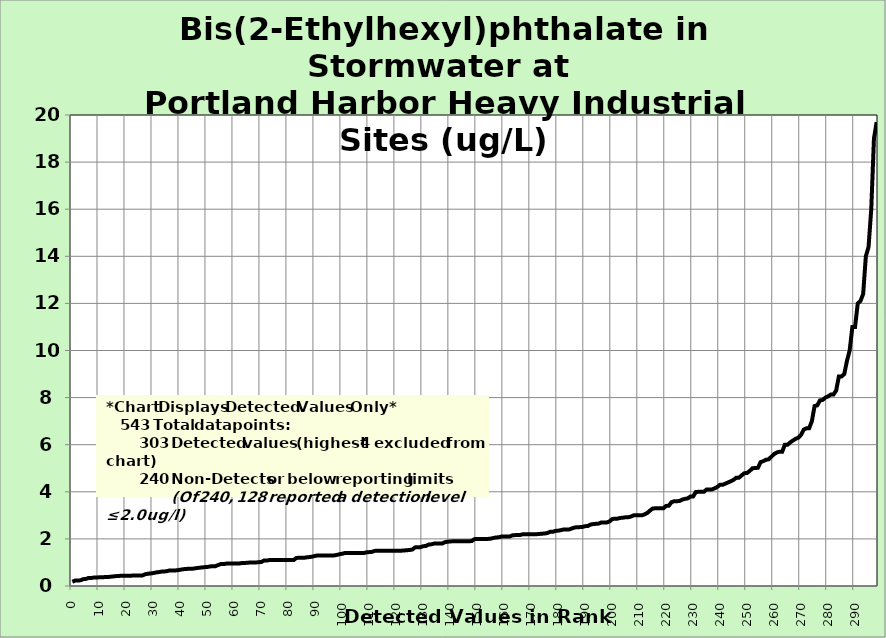
| Category | BEHP |
|---|---|
| 0.0 | 0.18 |
| 1.0 | 0.23 |
| 2.0 | 0.236 |
| 3.0 | 0.24 |
| 4.0 | 0.29 |
| 5.0 | 0.3 |
| 6.0 | 0.34 |
| 7.0 | 0.34 |
| 8.0 | 0.36 |
| 9.0 | 0.36 |
| 10.0 | 0.37 |
| 11.0 | 0.37 |
| 12.0 | 0.379 |
| 13.0 | 0.382 |
| 14.0 | 0.391 |
| 15.0 | 0.405 |
| 16.0 | 0.419 |
| 17.0 | 0.42 |
| 18.0 | 0.44 |
| 19.0 | 0.44 |
| 20.0 | 0.44 |
| 21.0 | 0.44 |
| 22.0 | 0.44 |
| 23.0 | 0.447 |
| 24.0 | 0.45 |
| 25.0 | 0.45 |
| 26.0 | 0.45 |
| 27.0 | 0.5 |
| 28.0 | 0.52 |
| 29.0 | 0.533 |
| 30.0 | 0.55 |
| 31.0 | 0.575 |
| 32.0 | 0.59 |
| 33.0 | 0.61 |
| 34.0 | 0.616 |
| 35.0 | 0.63 |
| 36.0 | 0.66 |
| 37.0 | 0.66 |
| 38.0 | 0.66 |
| 39.0 | 0.67 |
| 40.0 | 0.691 |
| 41.0 | 0.71 |
| 42.0 | 0.724 |
| 43.0 | 0.73 |
| 44.0 | 0.73 |
| 45.0 | 0.74 |
| 46.0 | 0.76 |
| 47.0 | 0.774 |
| 48.0 | 0.788 |
| 49.0 | 0.8 |
| 50.0 | 0.81 |
| 51.0 | 0.83 |
| 52.0 | 0.84 |
| 53.0 | 0.842 |
| 54.0 | 0.89 |
| 55.0 | 0.93 |
| 56.0 | 0.93 |
| 57.0 | 0.95 |
| 58.0 | 0.952 |
| 59.0 | 0.952 |
| 60.0 | 0.952 |
| 61.0 | 0.96 |
| 62.0 | 0.96 |
| 63.0 | 0.977 |
| 64.0 | 0.979 |
| 65.0 | 0.99 |
| 66.0 | 0.997 |
| 67.0 | 1 |
| 68.0 | 1 |
| 69.0 | 1.01 |
| 70.0 | 1.02 |
| 71.0 | 1.08 |
| 72.0 | 1.08 |
| 73.0 | 1.1 |
| 74.0 | 1.1 |
| 75.0 | 1.1 |
| 76.0 | 1.1 |
| 77.0 | 1.1 |
| 78.0 | 1.1 |
| 79.0 | 1.1 |
| 80.0 | 1.1 |
| 81.0 | 1.1 |
| 82.0 | 1.1 |
| 83.0 | 1.19 |
| 84.0 | 1.2 |
| 85.0 | 1.2 |
| 86.0 | 1.2 |
| 87.0 | 1.22 |
| 88.0 | 1.23 |
| 89.0 | 1.25 |
| 90.0 | 1.28 |
| 91.0 | 1.3 |
| 92.0 | 1.3 |
| 93.0 | 1.3 |
| 94.0 | 1.3 |
| 95.0 | 1.3 |
| 96.0 | 1.3 |
| 97.0 | 1.3 |
| 98.0 | 1.32 |
| 99.0 | 1.35 |
| 100.0 | 1.37 |
| 101.0 | 1.4 |
| 102.0 | 1.4 |
| 103.0 | 1.4 |
| 104.0 | 1.4 |
| 105.0 | 1.4 |
| 106.0 | 1.4 |
| 107.0 | 1.4 |
| 108.0 | 1.4 |
| 109.0 | 1.43 |
| 110.0 | 1.44 |
| 111.0 | 1.45 |
| 112.0 | 1.49 |
| 113.0 | 1.5 |
| 114.0 | 1.5 |
| 115.0 | 1.5 |
| 116.0 | 1.5 |
| 117.0 | 1.5 |
| 118.0 | 1.5 |
| 119.0 | 1.5 |
| 120.0 | 1.5 |
| 121.0 | 1.5 |
| 122.0 | 1.5 |
| 123.0 | 1.51 |
| 124.0 | 1.52 |
| 125.0 | 1.53 |
| 126.0 | 1.55 |
| 127.0 | 1.64 |
| 128.0 | 1.65 |
| 129.0 | 1.65 |
| 130.0 | 1.69 |
| 131.0 | 1.7 |
| 132.0 | 1.76 |
| 133.0 | 1.77 |
| 134.0 | 1.8 |
| 135.0 | 1.8 |
| 136.0 | 1.8 |
| 137.0 | 1.8 |
| 138.0 | 1.86 |
| 139.0 | 1.88 |
| 140.0 | 1.89 |
| 141.0 | 1.9 |
| 142.0 | 1.9 |
| 143.0 | 1.9 |
| 144.0 | 1.9 |
| 145.0 | 1.9 |
| 146.0 | 1.9 |
| 147.0 | 1.9 |
| 148.0 | 1.91 |
| 149.0 | 1.99 |
| 150.0 | 2 |
| 151.0 | 2 |
| 152.0 | 2 |
| 153.0 | 2 |
| 154.0 | 2 |
| 155.0 | 2.01 |
| 156.0 | 2.04 |
| 157.0 | 2.06 |
| 158.0 | 2.07 |
| 159.0 | 2.1 |
| 160.0 | 2.1 |
| 161.0 | 2.1 |
| 162.0 | 2.1 |
| 163.0 | 2.15 |
| 164.0 | 2.16 |
| 165.0 | 2.17 |
| 166.0 | 2.17 |
| 167.0 | 2.2 |
| 168.0 | 2.2 |
| 169.0 | 2.2 |
| 170.0 | 2.2 |
| 171.0 | 2.2 |
| 172.0 | 2.2 |
| 173.0 | 2.21 |
| 174.0 | 2.22 |
| 175.0 | 2.23 |
| 176.0 | 2.25 |
| 177.0 | 2.3 |
| 178.0 | 2.3 |
| 179.0 | 2.34 |
| 180.0 | 2.35 |
| 181.0 | 2.37 |
| 182.0 | 2.4 |
| 183.0 | 2.4 |
| 184.0 | 2.4 |
| 185.0 | 2.44 |
| 186.0 | 2.48 |
| 187.0 | 2.5 |
| 188.0 | 2.5 |
| 189.0 | 2.51 |
| 190.0 | 2.54 |
| 191.0 | 2.55 |
| 192.0 | 2.61 |
| 193.0 | 2.63 |
| 194.0 | 2.64 |
| 195.0 | 2.65 |
| 196.0 | 2.7 |
| 197.0 | 2.7 |
| 198.0 | 2.7 |
| 199.0 | 2.74 |
| 200.0 | 2.84 |
| 201.0 | 2.86 |
| 202.0 | 2.86 |
| 203.0 | 2.89 |
| 204.0 | 2.9 |
| 205.0 | 2.92 |
| 206.0 | 2.92 |
| 207.0 | 2.95 |
| 208.0 | 3 |
| 209.0 | 3 |
| 210.0 | 3 |
| 211.0 | 3 |
| 212.0 | 3.04 |
| 213.0 | 3.1 |
| 214.0 | 3.2 |
| 215.0 | 3.29 |
| 216.0 | 3.3 |
| 217.0 | 3.3 |
| 218.0 | 3.3 |
| 219.0 | 3.3 |
| 220.0 | 3.4 |
| 221.0 | 3.41 |
| 222.0 | 3.56 |
| 223.0 | 3.6 |
| 224.0 | 3.6 |
| 225.0 | 3.61 |
| 226.0 | 3.67 |
| 227.0 | 3.7 |
| 228.0 | 3.72 |
| 229.0 | 3.8 |
| 230.0 | 3.8 |
| 231.0 | 3.99 |
| 232.0 | 4 |
| 233.0 | 4 |
| 234.0 | 4 |
| 235.0 | 4.1 |
| 236.0 | 4.1 |
| 237.0 | 4.1 |
| 238.0 | 4.15 |
| 239.0 | 4.21 |
| 240.0 | 4.3 |
| 241.0 | 4.3 |
| 242.0 | 4.35 |
| 243.0 | 4.4 |
| 244.0 | 4.45 |
| 245.0 | 4.51 |
| 246.0 | 4.6 |
| 247.0 | 4.6 |
| 248.0 | 4.7 |
| 249.0 | 4.79 |
| 250.0 | 4.8 |
| 251.0 | 4.89 |
| 252.0 | 5 |
| 253.0 | 5.01 |
| 254.0 | 5.02 |
| 255.0 | 5.26 |
| 256.0 | 5.3 |
| 257.0 | 5.36 |
| 258.0 | 5.38 |
| 259.0 | 5.49 |
| 260.0 | 5.6 |
| 261.0 | 5.67 |
| 262.0 | 5.7 |
| 263.0 | 5.7 |
| 264.0 | 6 |
| 265.0 | 6 |
| 266.0 | 6.1 |
| 267.0 | 6.18 |
| 268.0 | 6.25 |
| 269.0 | 6.3 |
| 270.0 | 6.42 |
| 271.0 | 6.64 |
| 272.0 | 6.7 |
| 273.0 | 6.7 |
| 274.0 | 7 |
| 275.0 | 7.64 |
| 276.0 | 7.67 |
| 277.0 | 7.88 |
| 278.0 | 7.9 |
| 279.0 | 8 |
| 280.0 | 8.05 |
| 281.0 | 8.13 |
| 282.0 | 8.13 |
| 283.0 | 8.3 |
| 284.0 | 8.9 |
| 285.0 | 8.9 |
| 286.0 | 9 |
| 287.0 | 9.56 |
| 288.0 | 10 |
| 289.0 | 11 |
| 290.0 | 11 |
| 291.0 | 12 |
| 292.0 | 12.1 |
| 293.0 | 12.4 |
| 294.0 | 14 |
| 295.0 | 14.4 |
| 296.0 | 16 |
| 297.0 | 19 |
| 298.0 | 19.7 |